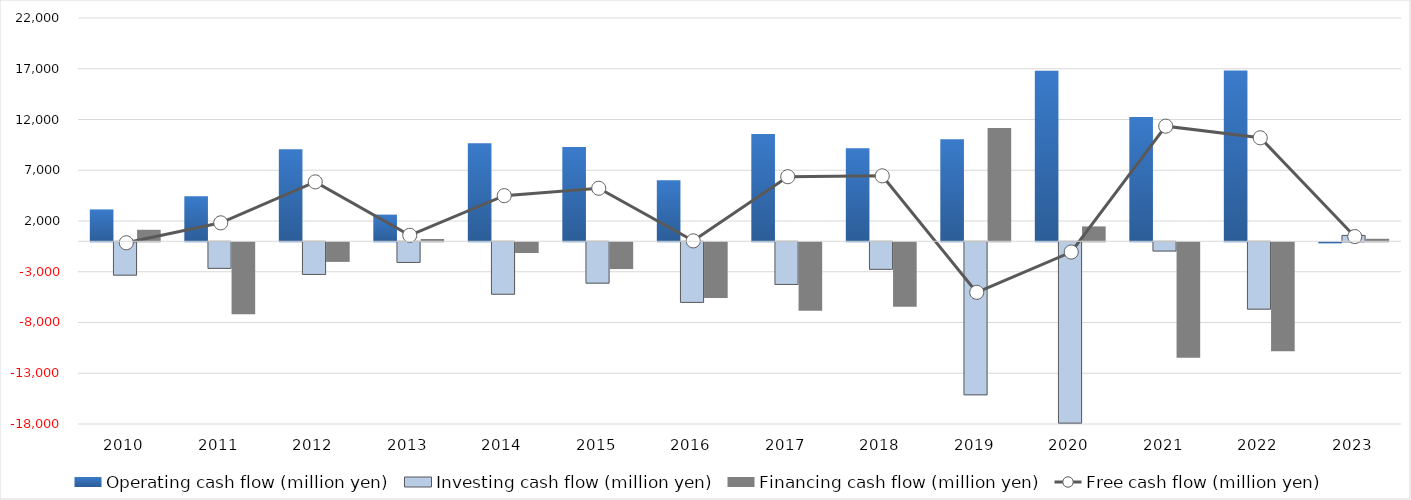
| Category | Operating cash flow (million yen) | Investing cash flow (million yen) | Financing cash flow (million yen) |
|---|---|---|---|
| 2010 | 3141 | -3286 | 1135 |
| 2011 | 4438 | -2618 | -7095 |
| 2012 | 9074 | -3218 | -1929 |
| 2013 | 2624 | -2033 | 224 |
| 2014 | 9663 | -5168 | -1054 |
| 2015 | 9299 | -4072 | -2635 |
| 2016 | 6016 | -5972 | -5486 |
| 2017 | 10566 | -4201 | -6734 |
| 2018 | 9158 | -2711 | -6342 |
| 2019 | 10052 | -15079 | 11165 |
| 2020 | 16807 | -17863 | 1468 |
| 2021 | 12254 | -910 | -11369 |
| 2022 | 16834 | -6636 | -10737 |
| 2023 | -107 | 575.306 | 247.125 |